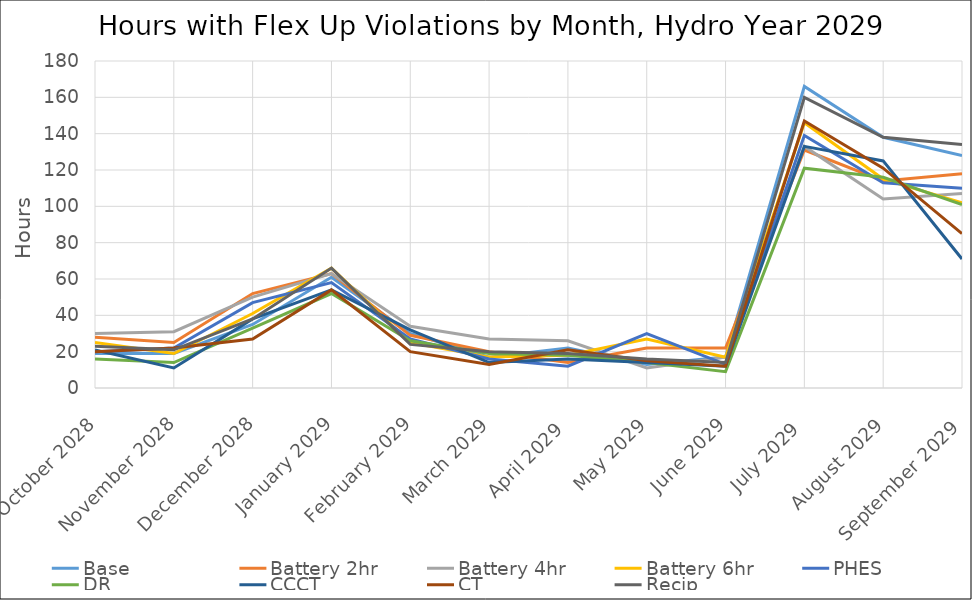
| Category | Base | Battery 2hr | Battery 4hr | Battery 6hr | PHES | DR | CCCT | CT | Recip |
|---|---|---|---|---|---|---|---|---|---|
| 2028-10-01 | 19 | 28 | 30 | 25 | 20 | 16 | 21 | 20 | 23 |
| 2028-11-01 | 19 | 25 | 31 | 19 | 22 | 14 | 11 | 22 | 21 |
| 2028-12-01 | 35 | 52 | 50 | 41 | 47 | 33 | 38 | 27 | 38 |
| 2029-01-01 | 61 | 63 | 63 | 66 | 58 | 52 | 54 | 54 | 66 |
| 2029-02-01 | 30 | 29 | 34 | 25 | 27 | 26 | 32 | 20 | 24 |
| 2029-03-01 | 17 | 20 | 27 | 17 | 16 | 19 | 14 | 13 | 20 |
| 2029-04-01 | 22 | 14 | 26 | 18 | 12 | 18 | 16 | 21 | 19 |
| 2029-05-01 | 13 | 22 | 11 | 27 | 30 | 14 | 14 | 15 | 16 |
| 2029-06-01 | 17 | 22 | 17 | 17 | 13 | 9 | 12 | 12 | 14 |
| 2029-07-01 | 166 | 131 | 133 | 146 | 139 | 121 | 133 | 147 | 160 |
| 2029-08-01 | 138 | 114 | 104 | 115 | 113 | 116 | 125 | 121 | 138 |
| 2029-09-01 | 128 | 118 | 107 | 102 | 110 | 101 | 71 | 85 | 134 |